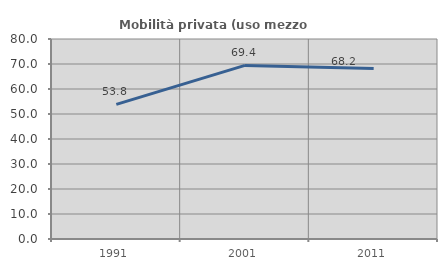
| Category | Mobilità privata (uso mezzo privato) |
|---|---|
| 1991.0 | 53.848 |
| 2001.0 | 69.444 |
| 2011.0 | 68.152 |